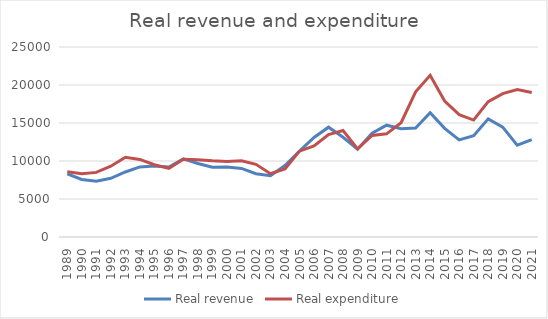
| Category | Real revenue | Real expenditure |
|---|---|---|
| 1989.0 | 8302.369 | 8590.606 |
| 1990.0 | 7571.228 | 8338.381 |
| 1991.0 | 7345.142 | 8501.812 |
| 1992.0 | 7723.031 | 9320.473 |
| 1993.0 | 8554.618 | 10492.104 |
| 1994.0 | 9226.148 | 10203.61 |
| 1995.0 | 9329.28 | 9510.273 |
| 1996.0 | 9212.017 | 9032.893 |
| 1997.0 | 10282.762 | 10237.929 |
| 1998.0 | 9673.76 | 10176.587 |
| 1999.0 | 9189.989 | 10020.987 |
| 2000.0 | 9208.986 | 9921.987 |
| 2001.0 | 9018.074 | 10035.75 |
| 2002.0 | 8323.879 | 9559.898 |
| 2003.0 | 8058.951 | 8333.39 |
| 2004.0 | 9404.085 | 8967.782 |
| 2005.0 | 11310.654 | 11294.304 |
| 2006.0 | 13091.461 | 11980.109 |
| 2007.0 | 14447.043 | 13468.23 |
| 2008.0 | 13121.771 | 14009.442 |
| 2009.0 | 11541.078 | 11603.37 |
| 2010.0 | 13667.891 | 13360.322 |
| 2011.0 | 14708.54 | 13576.578 |
| 2012.0 | 14242.558 | 15035.517 |
| 2013.0 | 14343.846 | 19094.887 |
| 2014.0 | 16355.47 | 21285.153 |
| 2015.0 | 14296.912 | 17890.533 |
| 2016.0 | 12768.854 | 16097 |
| 2017.0 | 13315.788 | 15389.336 |
| 2018.0 | 15543.021 | 17804.219 |
| 2019.0 | 14460.288 | 18870.092 |
| 2020.0 | 12093.3 | 19397.8 |
| 2021.0 | 12815.839 | 19013.402 |